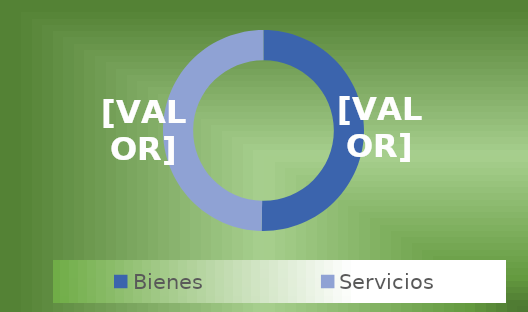
| Category | Series 0 |
|---|---|
| Bienes | 0.708 |
| Servicios | 0.7 |